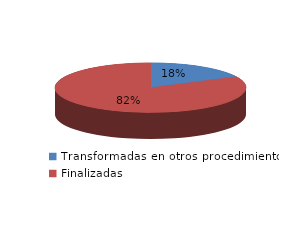
| Category | Series 0 |
|---|---|
| Transformadas en otros procedimientos | 1929 |
| Finalizadas | 9017 |